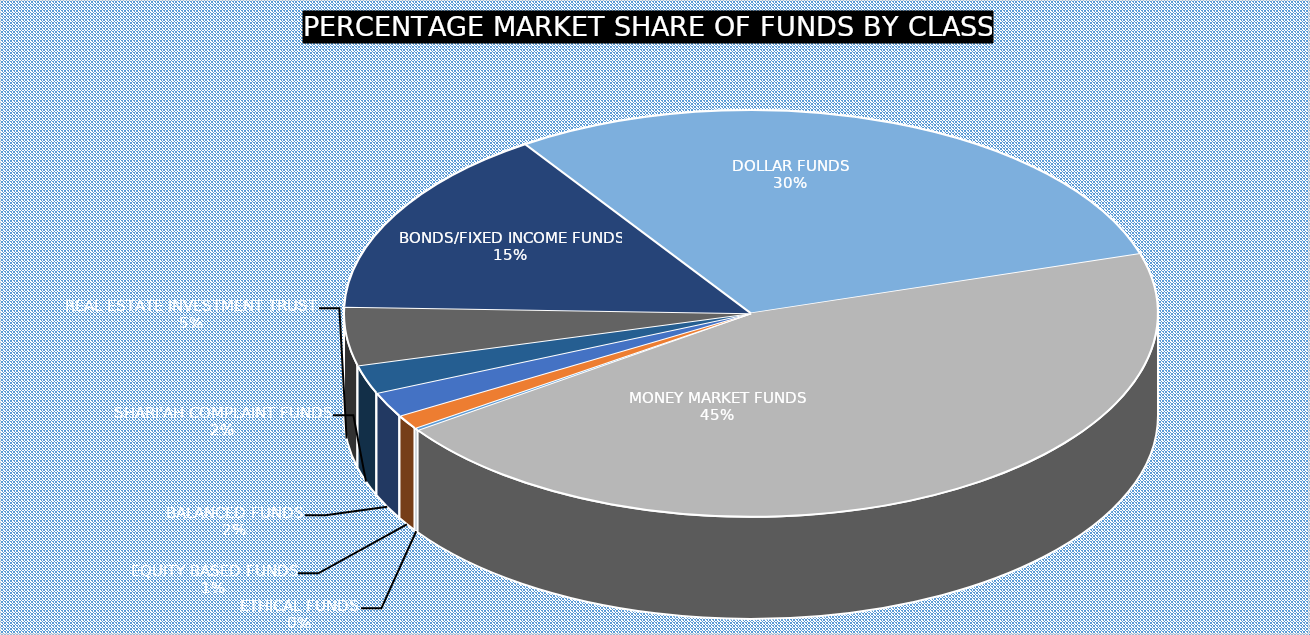
| Category | September 2023 |
|---|---|
| ETHICAL FUNDS | 3868845501.63 |
| EQUITY BASED FUNDS | 22305170580.12 |
| BALANCED FUNDS | 39942138650.64 |
| SHARI'AH COMPLAINT FUNDS | 45423108829.43 |
| REAL ESTATE INVESTMENT TRUST | 92422244214.65 |
| BONDS/FIXED INCOME FUNDS | 300772207942.51 |
| DOLLAR FUNDS | 590414681594.431 |
| MONEY MARKET FUNDS | 895470023696.09 |